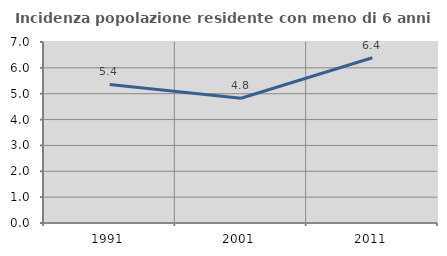
| Category | Incidenza popolazione residente con meno di 6 anni |
|---|---|
| 1991.0 | 5.359 |
| 2001.0 | 4.825 |
| 2011.0 | 6.39 |